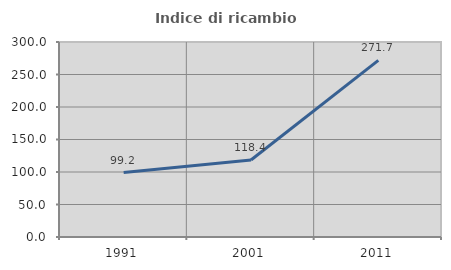
| Category | Indice di ricambio occupazionale  |
|---|---|
| 1991.0 | 99.168 |
| 2001.0 | 118.448 |
| 2011.0 | 271.749 |